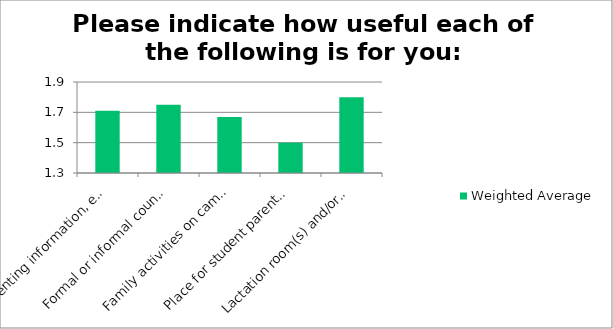
| Category | Weighted Average |
|---|---|
| Parenting information, education, and/or help | 1.71 |
| Formal or informal counseling or coaching specifically for student parents | 1.75 |
| Family activities on campus | 1.67 |
| Place for student parents (with or without children) to gather on campus | 1.5 |
| Lactation room(s) and/or diaper changing areas | 1.8 |